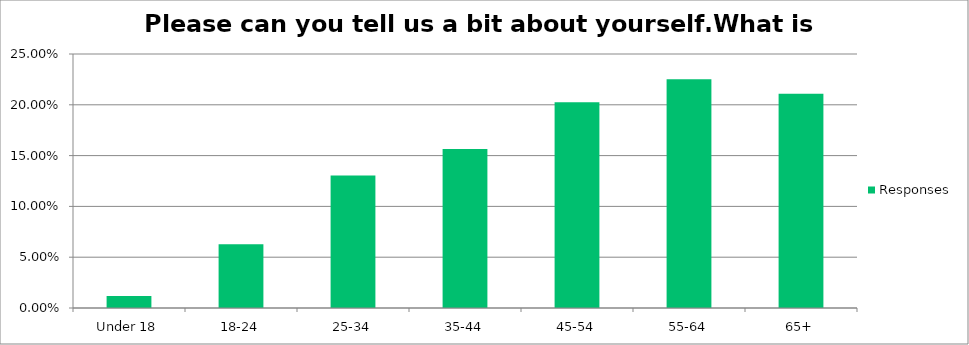
| Category | Responses |
|---|---|
| Under 18 | 0.012 |
| 18-24 | 0.063 |
| 25-34 | 0.13 |
| 35-44 | 0.156 |
| 45-54 | 0.203 |
| 55-64 | 0.225 |
| 65+ | 0.211 |